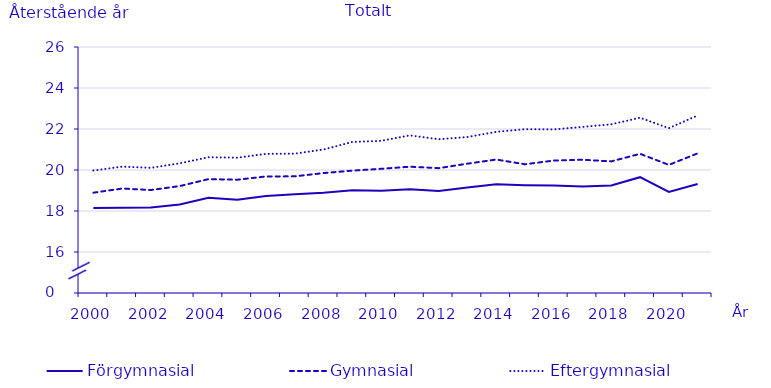
| Category | Förgymnasial | Gymnasial | Eftergymnasial |
|---|---|---|---|
| 2000.0 | 18.146 | 18.893 | 19.974 |
| 2001.0 | 18.158 | 19.096 | 20.164 |
| 2002.0 | 18.167 | 19.022 | 20.105 |
| 2003.0 | 18.318 | 19.216 | 20.325 |
| 2004.0 | 18.646 | 19.555 | 20.623 |
| 2005.0 | 18.552 | 19.526 | 20.6 |
| 2006.0 | 18.73 | 19.685 | 20.787 |
| 2007.0 | 18.817 | 19.691 | 20.798 |
| 2008.0 | 18.885 | 19.85 | 20.999 |
| 2009.0 | 19.016 | 19.969 | 21.369 |
| 2010.0 | 18.989 | 20.058 | 21.422 |
| 2011.0 | 19.066 | 20.161 | 21.69 |
| 2012.0 | 18.98 | 20.09 | 21.5 |
| 2013.0 | 19.15 | 20.31 | 21.61 |
| 2014.0 | 19.31 | 20.51 | 21.86 |
| 2015.0 | 19.26 | 20.28 | 21.99 |
| 2016.0 | 19.24 | 20.46 | 21.98 |
| 2017.0 | 19.2 | 20.5 | 22.1 |
| 2018.0 | 19.24 | 20.42 | 22.23 |
| 2019.0 | 19.65 | 20.79 | 22.55 |
| 2020.0 | 18.93 | 20.25 | 22.04 |
| 2021.0 | 19.32 | 20.81 | 22.66 |